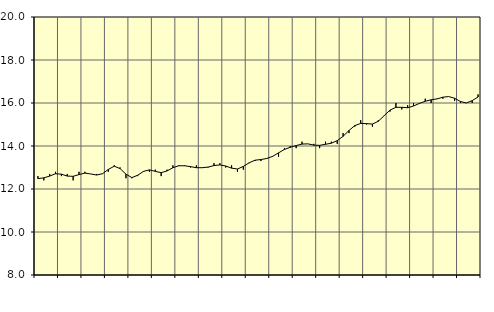
| Category | Piggar | Utbildning, SNI 85 |
|---|---|---|
| nan | 12.6 | 12.48 |
| 1.0 | 12.4 | 12.52 |
| 1.0 | 12.7 | 12.6 |
| 1.0 | 12.8 | 12.71 |
| nan | 12.6 | 12.69 |
| 2.0 | 12.7 | 12.6 |
| 2.0 | 12.4 | 12.59 |
| 2.0 | 12.8 | 12.67 |
| nan | 12.8 | 12.74 |
| 3.0 | 12.7 | 12.7 |
| 3.0 | 12.7 | 12.65 |
| 3.0 | 12.7 | 12.71 |
| nan | 12.8 | 12.91 |
| 4.0 | 13.1 | 13.06 |
| 4.0 | 13 | 12.95 |
| 4.0 | 12.5 | 12.69 |
| nan | 12.5 | 12.53 |
| 5.0 | 12.6 | 12.64 |
| 5.0 | 12.8 | 12.82 |
| 5.0 | 12.8 | 12.89 |
| nan | 12.9 | 12.82 |
| 6.0 | 12.6 | 12.76 |
| 6.0 | 12.9 | 12.84 |
| 6.0 | 13.1 | 12.99 |
| nan | 13.1 | 13.08 |
| 7.0 | 13.1 | 13.08 |
| 7.0 | 13 | 13.04 |
| 7.0 | 13.1 | 12.99 |
| nan | 13 | 12.99 |
| 8.0 | 13 | 13.02 |
| 8.0 | 13.2 | 13.09 |
| 8.0 | 13.2 | 13.12 |
| nan | 13 | 13.07 |
| 9.0 | 13.1 | 12.97 |
| 9.0 | 12.8 | 12.93 |
| 9.0 | 12.9 | 13.05 |
| nan | 13.2 | 13.22 |
| 10.0 | 13.3 | 13.34 |
| 10.0 | 13.3 | 13.37 |
| 10.0 | 13.4 | 13.42 |
| nan | 13.5 | 13.52 |
| 11.0 | 13.5 | 13.68 |
| 11.0 | 13.9 | 13.84 |
| 11.0 | 14 | 13.94 |
| nan | 13.9 | 14.02 |
| 12.0 | 14.2 | 14.09 |
| 12.0 | 14.1 | 14.1 |
| 12.0 | 14.1 | 14.04 |
| nan | 13.9 | 14.03 |
| 13.0 | 14.2 | 14.08 |
| 13.0 | 14.2 | 14.13 |
| 13.0 | 14.1 | 14.25 |
| nan | 14.6 | 14.45 |
| 14.0 | 14.6 | 14.72 |
| 14.0 | 14.9 | 14.95 |
| 14.0 | 15.2 | 15.05 |
| nan | 15 | 15.04 |
| 15.0 | 14.9 | 15.02 |
| 15.0 | 15.2 | 15.15 |
| 15.0 | 15.4 | 15.41 |
| nan | 15.6 | 15.67 |
| 16.0 | 16 | 15.8 |
| 16.0 | 15.7 | 15.8 |
| 16.0 | 15.9 | 15.78 |
| nan | 16 | 15.86 |
| 17.0 | 16 | 15.98 |
| 17.0 | 16.2 | 16.08 |
| 17.0 | 16 | 16.15 |
| nan | 16.2 | 16.19 |
| 18.0 | 16.2 | 16.27 |
| 18.0 | 16.3 | 16.3 |
| 18.0 | 16.1 | 16.22 |
| nan | 16 | 16.07 |
| 19.0 | 16 | 16 |
| 19.0 | 16 | 16.11 |
| 19.0 | 16.4 | 16.28 |